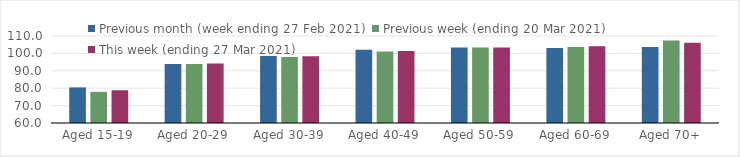
| Category | Previous month (week ending 27 Feb 2021) | Previous week (ending 20 Mar 2021) | This week (ending 27 Mar 2021) |
|---|---|---|---|
| Aged 15-19 | 80.45 | 77.91 | 78.83 |
| Aged 20-29 | 93.9 | 93.92 | 94.26 |
| Aged 30-39 | 98.57 | 97.95 | 98.34 |
| Aged 40-49 | 102.16 | 101.03 | 101.32 |
| Aged 50-59 | 103.42 | 103.42 | 103.45 |
| Aged 60-69 | 103.04 | 103.62 | 104.11 |
| Aged 70+ | 103.61 | 107.36 | 106.06 |